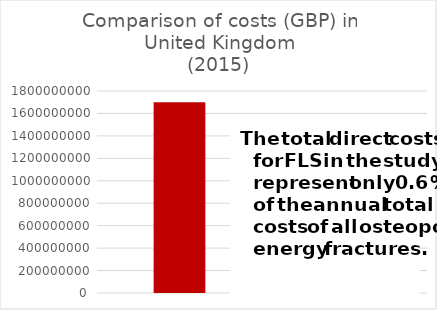
| Category | United Kingdom |
|---|---|
| 0 | 1700000000 |
| 1 | 9700000 |